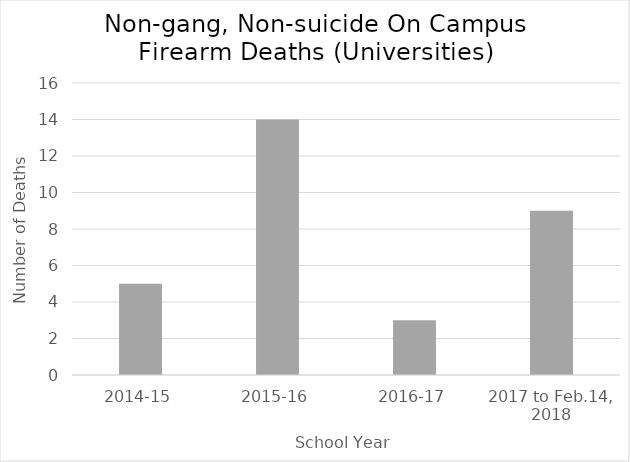
| Category | Universities |
|---|---|
| 2014-15 | 5 |
| 2015-16 | 14 |
| 2016-17 | 3 |
| 2017 to Feb.14, 2018 | 9 |